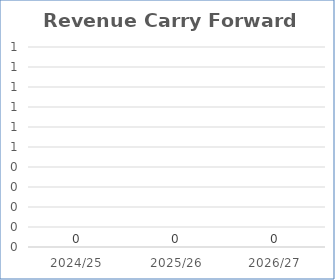
| Category | Revenue c/f £ |
|---|---|
| 2024/25 | 0 |
| 2025/26 | 0 |
| 2026/27 | 0 |